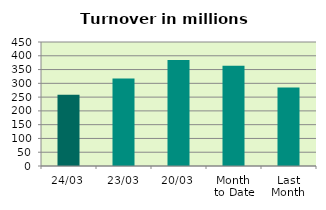
| Category | Series 0 |
|---|---|
| 24/03 | 258.13 |
| 23/03 | 317.984 |
| 20/03 | 384.607 |
| Month 
to Date | 363.512 |
| Last
Month | 285.08 |